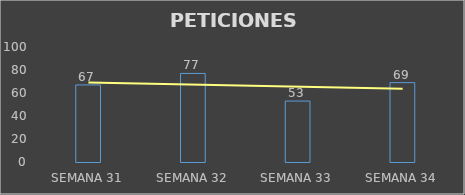
| Category | Series 0 |
|---|---|
| SEMANA 31 | 67 |
| SEMANA 32 | 77 |
| SEMANA 33 | 53 |
| SEMANA 34 | 69 |